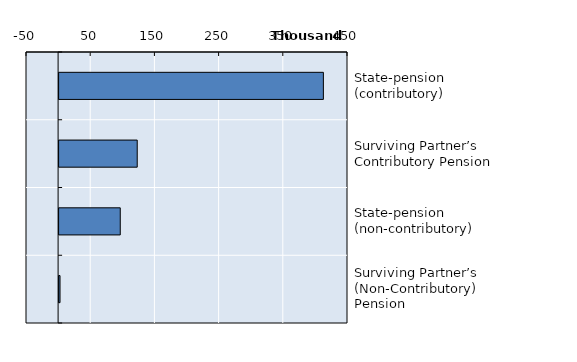
| Category | Series 0 |
|---|---|
| State-pension (contributory) | 411660 |
| Surviving Partner’s Contributory Pension | 121689 |
| State-pension (non-contributory) | 95263 |
| Surviving Partner’s (Non-Contributory) Pension | 1447 |